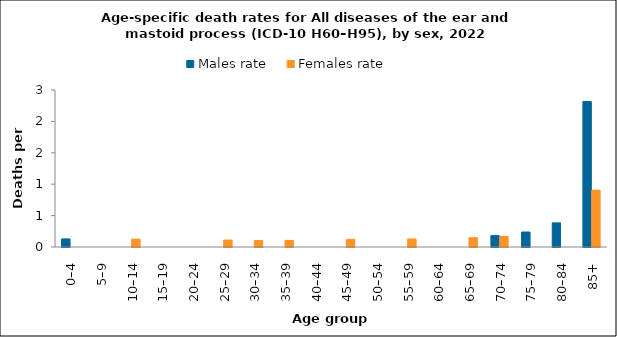
| Category | Males rate | Females rate |
|---|---|---|
| 0–4 | 0.129 | 0 |
| 5–9 | 0 | 0 |
| 10–14 | 0 | 0.126 |
| 15–19 | 0 | 0 |
| 20–24 | 0 | 0 |
| 25–29 | 0 | 0.111 |
| 30–34 | 0 | 0.103 |
| 35–39 | 0 | 0.105 |
| 40–44 | 0 | 0 |
| 45–49 | 0 | 0.122 |
| 50–54 | 0 | 0 |
| 55–59 | 0 | 0.128 |
| 60–64 | 0 | 0 |
| 65–69 | 0 | 0.148 |
| 70–74 | 0.181 | 0.168 |
| 75–79 | 0.239 | 0 |
| 80–84 | 0.384 | 0 |
| 85+ | 2.317 | 0.905 |